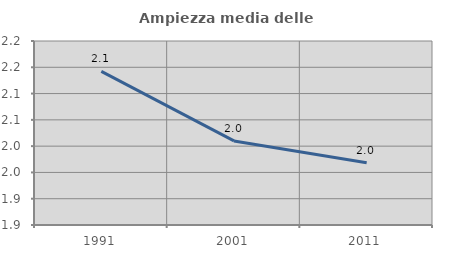
| Category | Ampiezza media delle famiglie |
|---|---|
| 1991.0 | 2.142 |
| 2001.0 | 2.01 |
| 2011.0 | 1.968 |